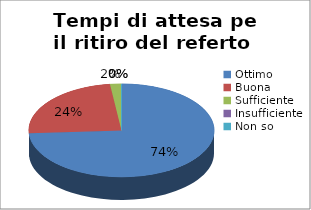
| Category | Tempi di attesa per il ritiro del referto |
|---|---|
| Ottimo | 37 |
| Buona | 12 |
| Sufficiente | 1 |
| Insufficiente | 0 |
| Non so | 0 |